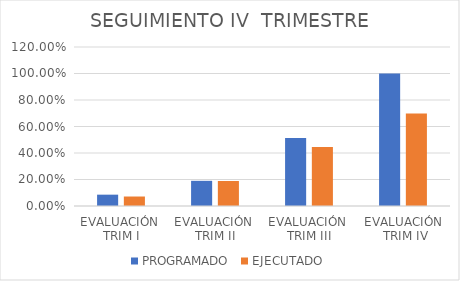
| Category | PROGRAMADO | EJECUTADO |
|---|---|---|
| EVALUACIÓN 
TRIM I | 0.086 | 0.072 |
| EVALUACIÓN 
TRIM II | 0.19 | 0.189 |
| EVALUACIÓN 
TRIM III | 0.514 | 0.445 |
| EVALUACIÓN
 TRIM IV | 1 | 0.698 |